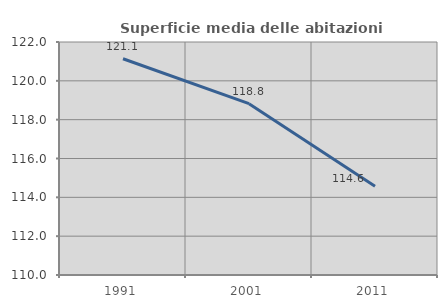
| Category | Superficie media delle abitazioni occupate |
|---|---|
| 1991.0 | 121.136 |
| 2001.0 | 118.824 |
| 2011.0 | 114.566 |